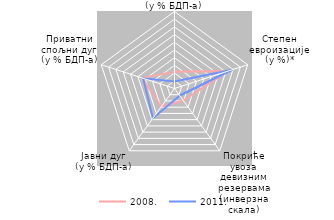
| Category | 2008. | 2011. |
|---|---|---|
| Дефицит платног биланса
(у % БДП-a) | 21.596 | 9.217 |
| Степен
евроизације
(у %)* | 72.995 | 78.936 |
| Покриће увоза девизним резервама
(инверзна скала) | 19.243 | 11.491 |
| Јавни дуг
(у % БДП-a) | 29.233 | 47.678 |
| Приватни
спољни дуг
(у % БДП-a) | 44.593 | 42.878 |